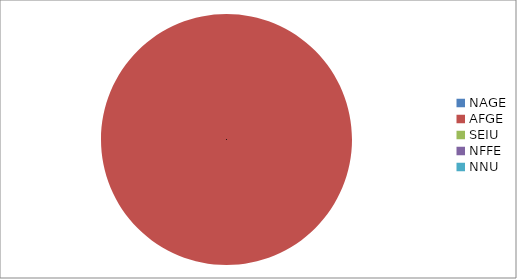
| Category | Series 0 |
|---|---|
| NAGE | 0 |
| AFGE | 11536 |
| SEIU | 0 |
| NFFE | 0 |
| NNU | 0 |